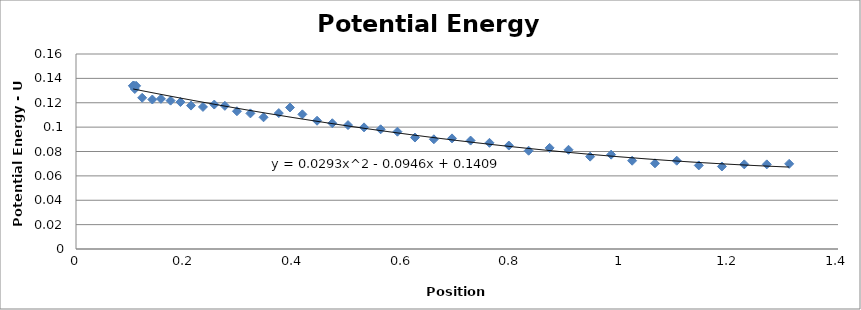
| Category | Potential Energy (J) |
|---|---|
| 0.106066 | 0.133 |
| 0.110508 | 0.134 |
| 0.108009 | 0.134 |
| 0.105788 | 0.134 |
| 0.106066 | 0.134 |
| 0.10551 | 0.134 |
| 0.105233 | 0.134 |
| 0.10551 | 0.134 |
| 0.104955 | 0.134 |
| 0.108009 | 0.131 |
| 0.121614 | 0.124 |
| 0.140218 | 0.123 |
| 0.156044 | 0.123 |
| 0.173814 | 0.122 |
| 0.191862 | 0.121 |
| 0.211298 | 0.118 |
| 0.233233 | 0.117 |
| 0.254057 | 0.119 |
| 0.273494 | 0.117 |
| 0.295706 | 0.113 |
| 0.320418 | 0.111 |
| 0.344574 | 0.108 |
| 0.372618 | 0.112 |
| 0.393164 | 0.116 |
| 0.415932 | 0.11 |
| 0.442865 | 0.105 |
| 0.470909 | 0.103 |
| 0.499785 | 0.102 |
| 0.529217 | 0.1 |
| 0.559759 | 0.098 |
| 0.59058 | 0.096 |
| 0.622788 | 0.091 |
| 0.657495 | 0.09 |
| 0.690814 | 0.091 |
| 0.724966 | 0.089 |
| 0.759674 | 0.087 |
| 0.795214 | 0.085 |
| 0.831587 | 0.081 |
| 0.870182 | 0.083 |
| 0.904889 | 0.081 |
| 0.944594 | 0.076 |
| 0.983189 | 0.077 |
| 1.02178 | 0.072 |
| 1.06371 | 0.07 |
| 1.10369 | 0.072 |
| 1.14423 | 0.069 |
| 1.18671 | 0.068 |
| 1.22781 | 0.069 |
| 1.26918 | 0.069 |
| 1.31027 | 0.07 |